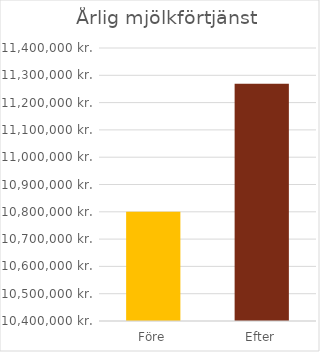
| Category | Series 0 |
|---|---|
| Före | 10800000 |
| Efter | 11269440 |